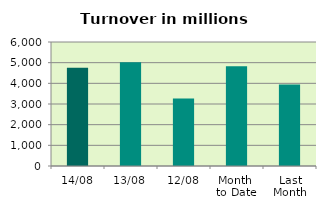
| Category | Series 0 |
|---|---|
| 14/08 | 4752.1 |
| 13/08 | 5017.342 |
| 12/08 | 3271.43 |
| Month 
to Date | 4821.048 |
| Last
Month | 3946.236 |